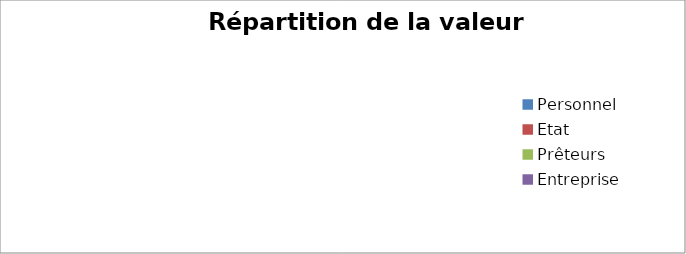
| Category | Series 0 |
|---|---|
| Personnel | 0 |
| Etat | 0 |
| Prêteurs | 0 |
| Entreprise | 0 |